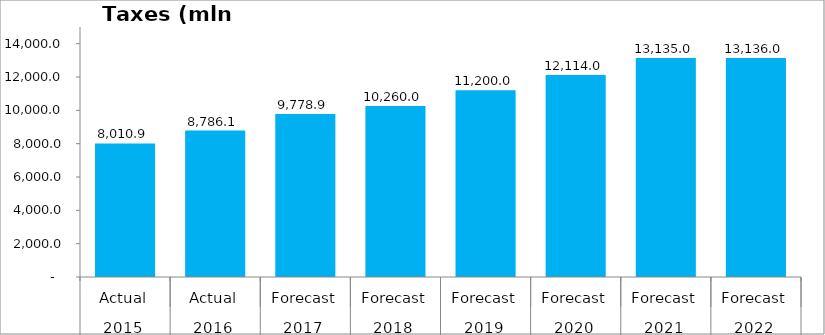
| Category | Taxes (mln GEL) |
|---|---|
| 0 | 8010.856 |
| 1 | 8786.065 |
| 2 | 9778.948 |
| 3 | 10260 |
| 4 | 11200 |
| 5 | 12114 |
| 6 | 13135 |
| 7 | 13136 |